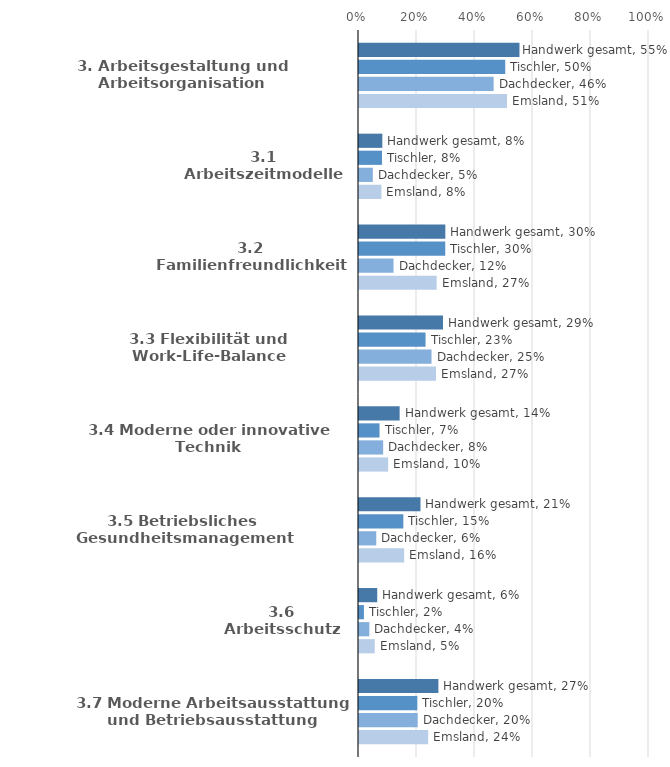
| Category | Handwerk gesamt | Tischler | Dachdecker | Emsland |
|---|---|---|---|---|
| 3. Arbeitsgestaltung und Arbeitsorganisation | 0.553 | 0.504 | 0.464 | 0.51 |
| 3.1 Arbeitszeitmodelle | 0.08 | 0.079 | 0.048 | 0.077 |
| 3.2 Familienfreundlichkeit | 0.298 | 0.297 | 0.119 | 0.268 |
| 3.3 Flexibilität und Work-Life-Balance | 0.29 | 0.229 | 0.25 | 0.266 |
| 3.4 Moderne oder innovative Technik | 0.14 | 0.071 | 0.083 | 0.101 |
| 3.5 Betriebsliches Gesundheitsmanagement | 0.212 | 0.153 | 0.06 | 0.156 |
| 3.6 Arbeitsschutz | 0.063 | 0.017 | 0.036 | 0.054 |
| 3.7 Moderne Arbeitsausstattung und Betriebsausstattung | 0.274 | 0.201 | 0.202 | 0.239 |